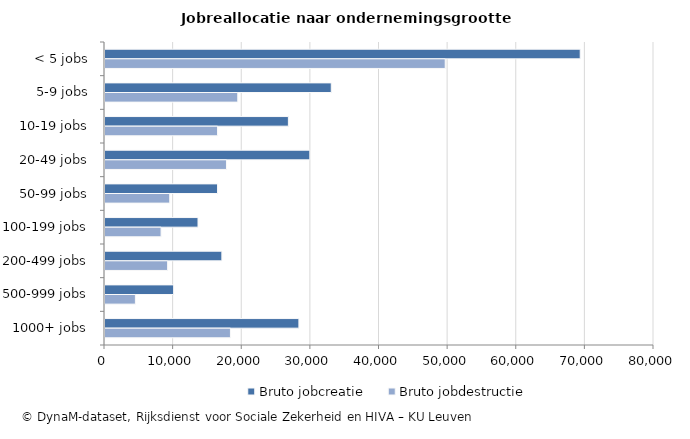
| Category | Bruto jobcreatie | Bruto jobdestructie |
|---|---|---|
| < 5 jobs | 69250 | 49576 |
| 5-9 jobs | 32972 | 19347 |
| 10-19 jobs | 26723 | 16400 |
| 20-49 jobs | 29849 | 17702 |
| 50-99 jobs | 16401 | 9435 |
| 100-199 jobs | 13554 | 8169 |
| 200-499 jobs | 17029 | 9126 |
| 500-999 jobs | 10003 | 4430 |
| 1000+ jobs | 28255 | 18280 |